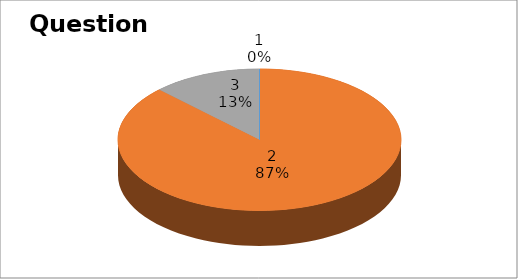
| Category | Series 0 |
|---|---|
| 0 | 0 |
| 1 | 7 |
| 2 | 1 |